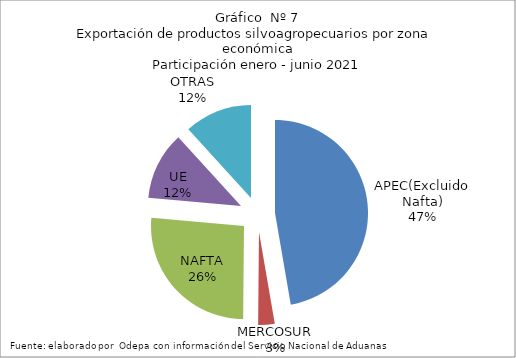
| Category | Series 0 |
|---|---|
| APEC(Excluido Nafta) | 4318261.89 |
| MERCOSUR | 261789.316 |
| NAFTA | 2397057.138 |
| UE | 1081403.009 |
| OTRAS | 1074677.647 |